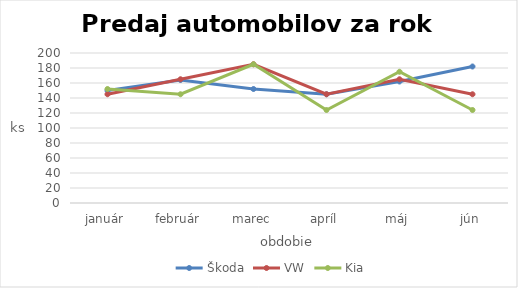
| Category | Škoda | VW | Kia |
|---|---|---|---|
| január | 150 | 145 | 152 |
| február | 164 | 165 | 145 |
| marec | 152 | 185 | 185 |
| apríl | 145 | 145 | 124 |
| máj | 162 | 165 | 175 |
| jún | 182 | 145 | 124 |